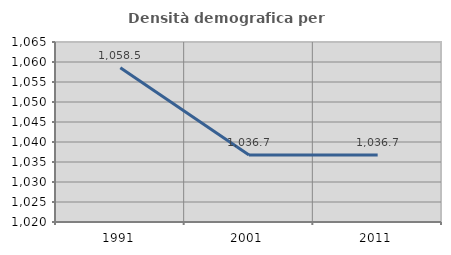
| Category | Densità demografica |
|---|---|
| 1991.0 | 1058.534 |
| 2001.0 | 1036.738 |
| 2011.0 | 1036.738 |